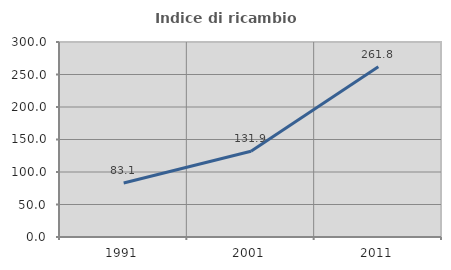
| Category | Indice di ricambio occupazionale  |
|---|---|
| 1991.0 | 83.099 |
| 2001.0 | 131.915 |
| 2011.0 | 261.765 |